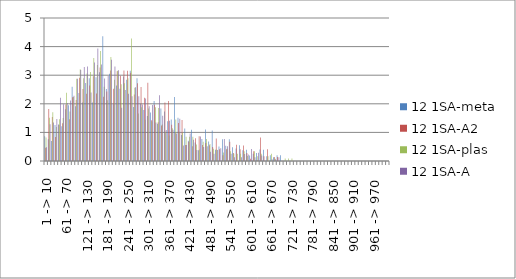
| Category | 12 1SA-meta | 12 1SA-A2 | 12 1SA-plas | 12 1SA-A |
|---|---|---|---|---|
| 1 -> 10 | 0.865 | 0.462 | 0.82 | 0.477 |
| 11 -> 20 | 0.762 | 1.815 | 1.508 | 1.283 |
| 21 -> 30 | 0.703 | 1.538 | 1.704 | 1.348 |
| 31 -> 40 | 1.255 | 0.838 | 1.193 | 1.471 |
| 41 -> 50 | 1.275 | 1.267 | 1.46 | 2.215 |
| 51 -> 60 | 1.217 | 1.316 | 1.501 | 1.984 |
| 61 -> 70 | 1.806 | 1.976 | 2.386 | 2.025 |
| 71 -> 80 | 1.948 | 1.46 | 1.728 | 2.115 |
| 81 -> 90 | 2.599 | 2.228 | 2.236 | 2.282 |
| 91 -> 100 | 1.91 | 2.136 | 2.877 | 2.877 |
| 101 -> 110 | 2.374 | 2.913 | 3.206 | 3.183 |
| 111 -> 120 | 2.043 | 2.515 | 2.894 | 3.289 |
| 121 -> 130 | 2.729 | 2.354 | 3.063 | 3.305 |
| 131 -> 140 | 2.894 | 2.637 | 3.116 | 2.399 |
| 141 -> 150 | 2.046 | 2.967 | 3.599 | 3.446 |
| 151 -> 160 | 2.93 | 2.362 | 3.356 | 3.932 |
| 161 -> 170 | 3.105 | 3.269 | 3.845 | 3.375 |
| 171 -> 180 | 4.358 | 2.243 | 2.6 | 2.887 |
| 181 -> 190 | 2.52 | 2.427 | 2.127 | 2.976 |
| 191 -> 200 | 3.047 | 3.164 | 3.639 | 3.542 |
| 201 -> 210 | 1.987 | 2.523 | 2.839 | 3.306 |
| 211 -> 220 | 2.639 | 3.136 | 3.153 | 3.175 |
| 221 -> 230 | 2.526 | 2.977 | 2.686 | 1.86 |
| 231 -> 240 | 2.95 | 3.16 | 2.72 | 2.485 |
| 241 -> 250 | 2.843 | 3.154 | 2.897 | 2.353 |
| 251 -> 260 | 3.159 | 3.089 | 4.286 | 2.268 |
| 261 -> 270 | 1.891 | 2.329 | 2.561 | 2.583 |
| 271 -> 280 | 2.891 | 2.717 | 1.658 | 2.261 |
| 281 -> 290 | 2.004 | 2.584 | 1.875 | 1.975 |
| 291 -> 300 | 1.779 | 2.213 | 1.446 | 2.188 |
| 301 -> 310 | 1.577 | 2.738 | 1.837 | 1.91 |
| 311 -> 320 | 1.696 | 1.425 | 1.38 | 1.956 |
| 321 -> 330 | 2.095 | 1.967 | 1.876 | 1.344 |
| 331 -> 340 | 1.3 | 1.356 | 1.852 | 2.296 |
| 341 -> 350 | 1.836 | 1.238 | 1.276 | 1.584 |
| 351 -> 360 | 1.729 | 2.047 | 1.023 | 1.083 |
| 361 -> 370 | 1.386 | 2.098 | 0.889 | 1.412 |
| 371 -> 380 | 1.448 | 1.266 | 1.148 | 1.093 |
| 381 -> 390 | 2.242 | 1 | 1.455 | 0.959 |
| 391 -> 400 | 1.517 | 1.329 | 1.023 | 1.476 |
| 401 -> 410 | 0.907 | 1.434 | 0.987 | 0.546 |
| 411 -> 420 | 1.14 | 0.56 | 0.852 | 0.559 |
| 421 -> 430 | 0.711 | 0.677 | 0.852 | 0.962 |
| 431 -> 440 | 1.092 | 0.513 | 0.852 | 0.741 |
| 441 -> 450 | 0.648 | 0.794 | 0.576 | 0.385 |
| 451 -> 460 | 0.379 | 0.867 | 0.398 | 0.857 |
| 461 -> 470 | 0.771 | 0.555 | 0.674 | 0.487 |
| 471 -> 480 | 1.104 | 0.632 | 0.767 | 0.513 |
| 481 -> 490 | 0.678 | 0.552 | 0.596 | 0.321 |
| 491 -> 500 | 1.068 | 0.493 | 0.426 | 0.257 |
| 501 -> 510 | 0.389 | 0.789 | 0.401 | 0.385 |
| 511 -> 520 | 0.508 | 0.414 | 0 | 0.449 |
| 521 -> 530 | 0.757 | 0.2 | 0.298 | 0.77 |
| 531 -> 540 | 0.536 | 0.414 | 0.426 | 0.513 |
| 541 -> 550 | 0.763 | 0.676 | 0.341 | 0.257 |
| 551 -> 560 | 0.479 | 0.276 | 0.256 | 0.128 |
| 561 -> 570 | 0.434 | 0.567 | 0.256 | 0 |
| 571 -> 580 | 0.554 | 0.41 | 0.256 | 0.128 |
| 581 -> 590 | 0.38 | 0.54 | 0.341 | 0.248 |
| 591 -> 600 | 0.394 | 0.276 | 0.171 | 0.231 |
| 601 -> 610 | 0.196 | 0.081 | 0 | 0.417 |
| 611 -> 620 | 0.254 | 0.343 | 0.341 | 0.128 |
| 621 -> 630 | 0.283 | 0.032 | 0.17 | 0.291 |
| 631 -> 640 | 0.402 | 0.82 | 0.256 | 0.192 |
| 641 -> 650 | 0.394 | 0.163 | 0 | 0 |
| 651 -> 660 | 0.162 | 0.414 | 0.17 | 0 |
| 661 -> 670 | 0.204 | 0 | 0.256 | 0.064 |
| 671 -> 680 | 0.133 | 0.138 | 0.085 | 0.064 |
| 681 -> 690 | 0.203 | 0.138 | 0 | 0.128 |
| 691 -> 700 | 0.2 | 0 | 0 | 0 |
| 701 -> 710 | 0 | 0 | 0.085 | 0 |
| 711 -> 720 | 0 | 0 | 0.085 | 0 |
| 721 -> 730 | 0 | 0 | 0.085 | 0 |
| 731 -> 740 | 0 | 0 | 0 | 0 |
| 741 -> 750 | 0 | 0 | 0 | 0 |
| 751 -> 760 | 0 | 0 | 0 | 0 |
| 761 -> 770 | 0 | 0 | 0 | 0 |
| 771 -> 780 | 0 | 0 | 0 | 0 |
| 781 -> 790 | 0 | 0 | 0 | 0 |
| 791 -> 800 | 0 | 0 | 0 | 0 |
| 801 -> 810 | 0 | 0 | 0 | 0 |
| 811 -> 820 | 0 | 0 | 0 | 0 |
| 821 -> 830 | 0 | 0 | 0 | 0 |
| 831 -> 840 | 0 | 0 | 0 | 0 |
| 841 -> 850 | 0 | 0 | 0 | 0 |
| 851 -> 860 | 0 | 0 | 0 | 0 |
| 861 -> 870 | 0 | 0 | 0 | 0 |
| 871 -> 880 | 0 | 0 | 0 | 0 |
| 881 -> 890 | 0 | 0 | 0 | 0 |
| 891 -> 900 | 0 | 0 | 0 | 0 |
| 901 -> 910 | 0 | 0 | 0 | 0 |
| 911 -> 920 | 0 | 0 | 0 | 0 |
| 921 -> 930 | 0 | 0 | 0 | 0 |
| 931 -> 940 | 0 | 0 | 0 | 0 |
| 941 -> 950 | 0 | 0 | 0 | 0 |
| 951 -> 960 | 0 | 0 | 0 | 0 |
| 961 -> 970 | 0 | 0 | 0 | 0 |
| 971 -> 980 | 0 | 0 | 0 | 0 |
| 981 -> 990 | 0 | 0 | 0 | 0 |
| 991 -> 1000 | 0 | 0 | 0 | 0 |
| 1001 -> 1010 | 0 | 0 | 0 | 0 |